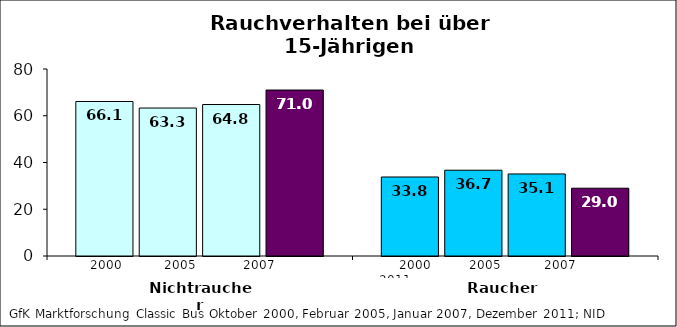
| Category | 2000 | 2005 | 2007 | 2011 |
|---|---|---|---|---|
| Nichtraucher | 66.1 | 63.3 | 64.8 | 71 |
| Raucher | 33.8 | 36.7 | 35.1 | 29 |